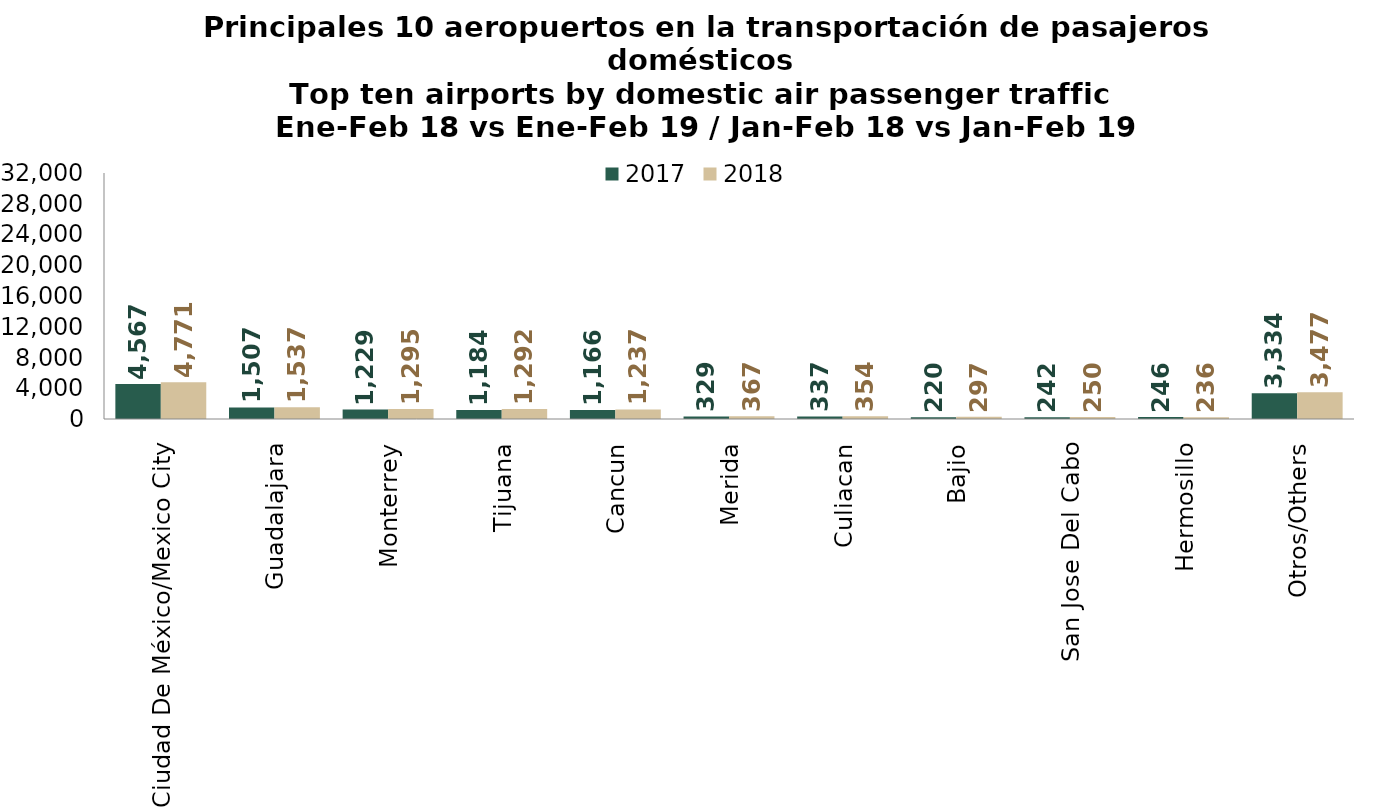
| Category | 2017 | 2018 |
|---|---|---|
| Ciudad De México/Mexico City | 4567.349 | 4770.606 |
| Guadalajara | 1507.095 | 1537.422 |
| Monterrey | 1229.369 | 1295.289 |
| Tijuana | 1183.578 | 1291.897 |
| Cancun | 1165.952 | 1236.797 |
| Merida | 328.755 | 366.545 |
| Culiacan | 336.993 | 354.452 |
| Bajio | 220.13 | 296.939 |
| San Jose Del Cabo | 241.866 | 249.73 |
| Hermosillo | 246.324 | 236.405 |
| Otros/Others | 3333.56 | 3476.952 |